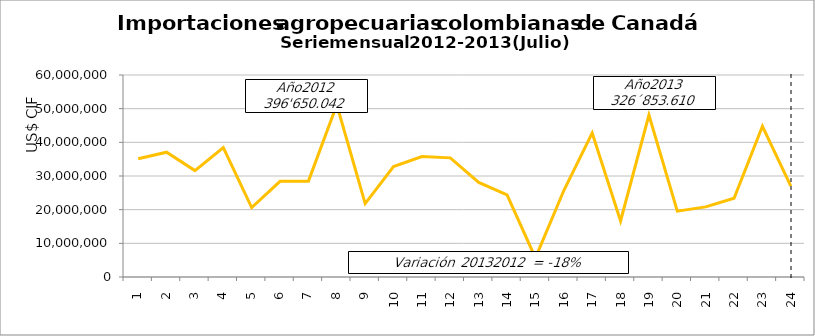
| Category | Series 0 |
|---|---|
| 0 | 35103439.69 |
| 1 | 37065794.64 |
| 2 | 31611586.16 |
| 3 | 38441961.41 |
| 4 | 20622061.96 |
| 5 | 28424675.53 |
| 6 | 28473705.1 |
| 7 | 51140720.48 |
| 8 | 21803264.54 |
| 9 | 32821251.2 |
| 10 | 35754552.15 |
| 11 | 35387029.24 |
| 12 | 28073919.16 |
| 13 | 24364802.04 |
| 14 | 5657570.31 |
| 15 | 25688543.28 |
| 16 | 42751616.5 |
| 17 | 16679352.66 |
| 18 | 48118123.79 |
| 19 | 19548131 |
| 20 | 20822811 |
| 21 | 23402029 |
| 22 | 44780163.67 |
| 23 | 26966548 |